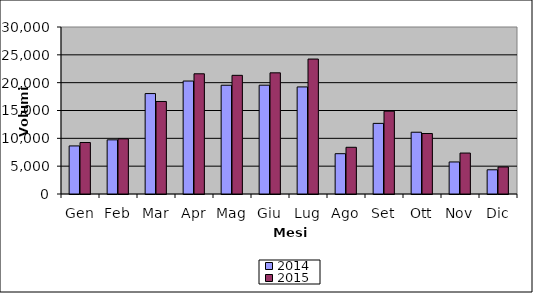
| Category | 2014 | 2015 |
|---|---|---|
| Gen | 8634 | 9246 |
| Feb | 9730 | 9910 |
| Mar | 18040 | 16621 |
| Apr | 20292 | 21596 |
| Mag | 19538 | 21317 |
| Giu | 19547 | 21767 |
| Lug | 19233 | 24241 |
| Ago | 7240 | 8391 |
| Set | 12685 | 14878 |
| Ott | 11096 | 10864 |
| Nov | 5756 | 7356 |
| Dic | 4350 | 4856 |